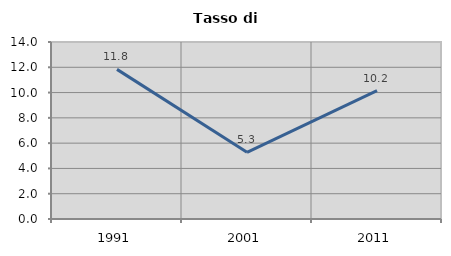
| Category | Tasso di disoccupazione   |
|---|---|
| 1991.0 | 11.836 |
| 2001.0 | 5.274 |
| 2011.0 | 10.152 |